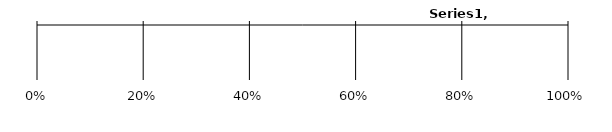
| Category | Series 0 |
|---|---|
| 0 | 16 |